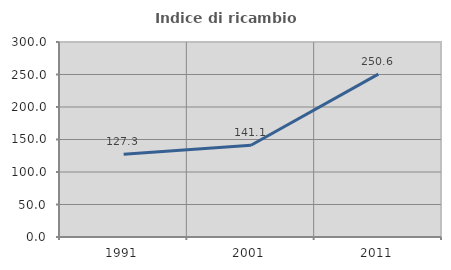
| Category | Indice di ricambio occupazionale  |
|---|---|
| 1991.0 | 127.338 |
| 2001.0 | 141.129 |
| 2011.0 | 250.575 |